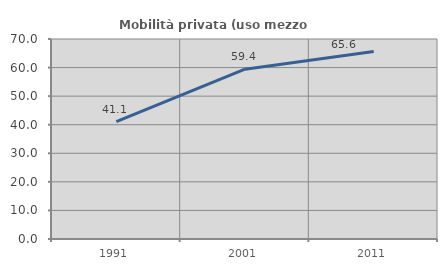
| Category | Mobilità privata (uso mezzo privato) |
|---|---|
| 1991.0 | 41.062 |
| 2001.0 | 59.419 |
| 2011.0 | 65.63 |